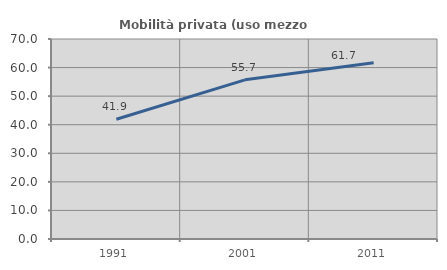
| Category | Mobilità privata (uso mezzo privato) |
|---|---|
| 1991.0 | 41.922 |
| 2001.0 | 55.709 |
| 2011.0 | 61.662 |